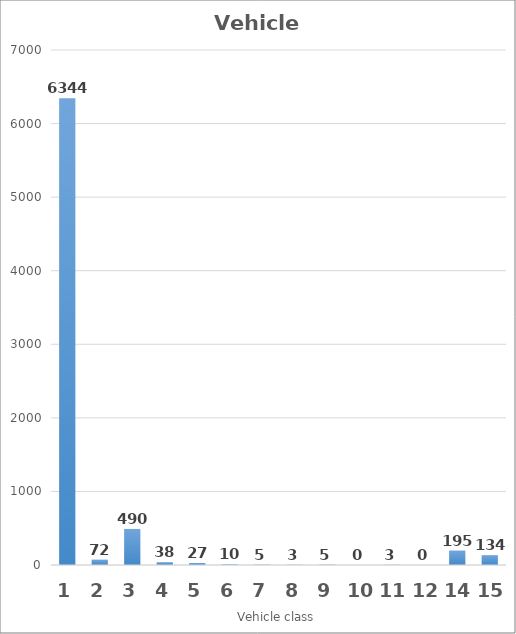
| Category | Series 0 |
|---|---|
| 1.0 | 6344 |
| 2.0 | 72 |
| 3.0 | 490 |
| 4.0 | 38 |
| 5.0 | 27 |
| 6.0 | 10 |
| 7.0 | 5 |
| 8.0 | 3 |
| 9.0 | 5 |
| 10.0 | 0 |
| 11.0 | 3 |
| 12.0 | 0 |
| 14.0 | 195 |
| 15.0 | 134 |